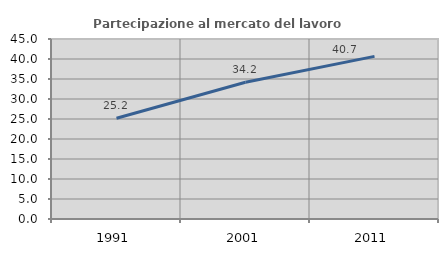
| Category | Partecipazione al mercato del lavoro  femminile |
|---|---|
| 1991.0 | 25.188 |
| 2001.0 | 34.194 |
| 2011.0 | 40.659 |